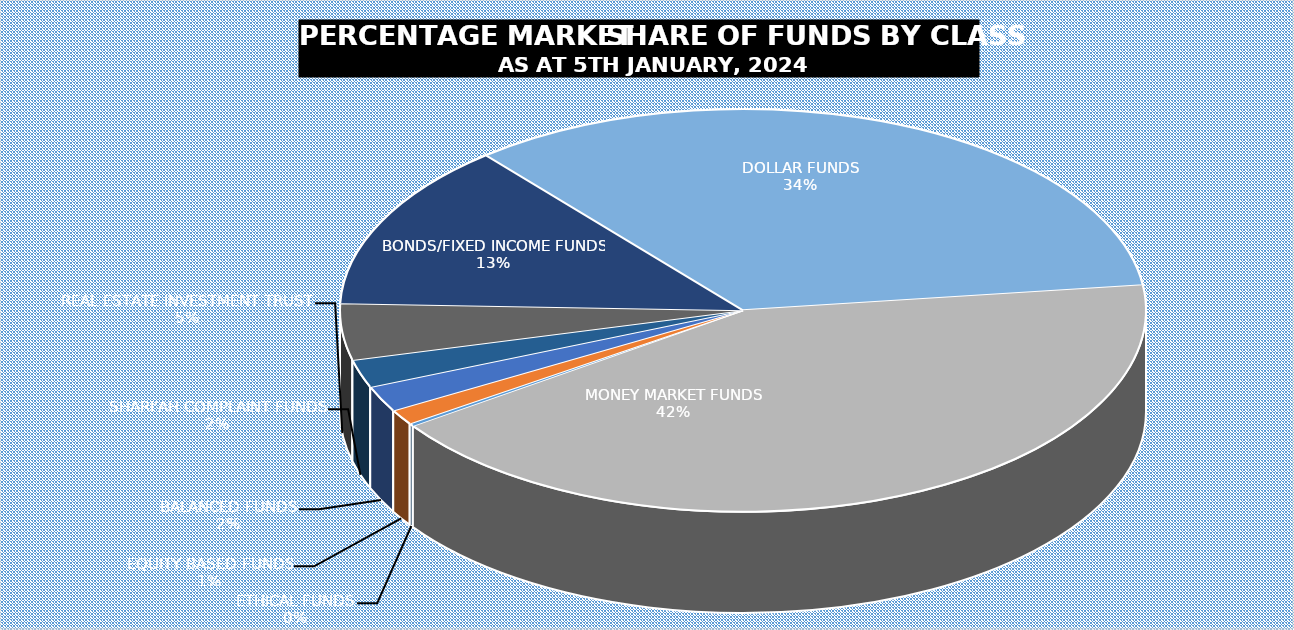
| Category | 5-Jan |
|---|---|
| ETHICAL FUNDS | 4619717314.71 |
| EQUITY BASED FUNDS | 26318158433.326 |
| BALANCED FUNDS | 44249451355.677 |
| SHARI'AH COMPLAINT FUNDS | 47837509740.909 |
| REAL ESTATE INVESTMENT TRUST | 96815736652.814 |
| BONDS/FIXED INCOME FUNDS | 287055376560.052 |
| DOLLAR FUNDS | 726920775377.211 |
| MONEY MARKET FUNDS | 903708318785.28 |